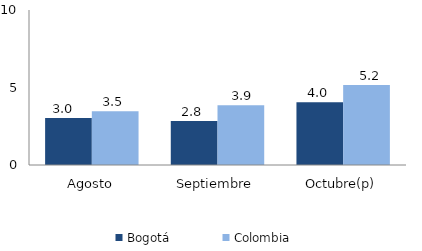
| Category | Bogotá | Colombia |
|---|---|---|
| Agosto | 3.036 | 3.474 |
| Septiembre | 2.846 | 3.855 |
| Octubre(p) | 4.045 | 5.157 |